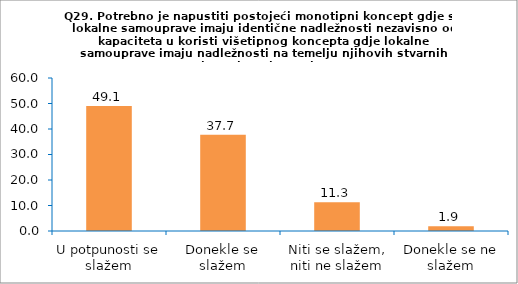
| Category | Series 0 |
|---|---|
| U potpunosti se slažem | 49.057 |
| Donekle se slažem | 37.736 |
| Niti se slažem, niti ne slažem | 11.321 |
| Donekle se ne slažem | 1.887 |